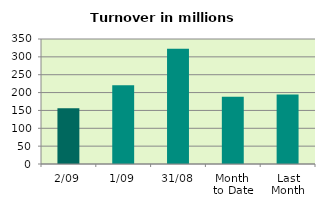
| Category | Series 0 |
|---|---|
| 2/09 | 156.116 |
| 1/09 | 220.314 |
| 31/08 | 322.723 |
| Month 
to Date | 188.215 |
| Last
Month | 194.848 |